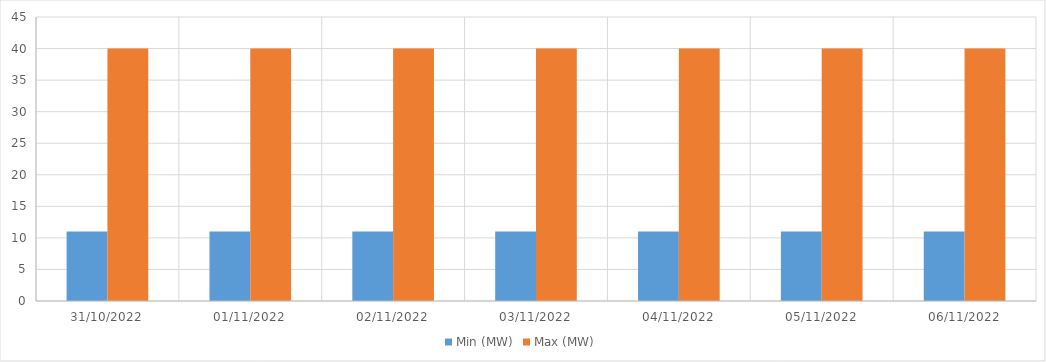
| Category | Min (MW) | Max (MW) |
|---|---|---|
| 31/10/2022 | 11 | 40 |
| 01/11/2022 | 11 | 40 |
| 02/11/2022 | 11 | 40 |
| 03/11/2022 | 11 | 40 |
| 04/11/2022 | 11 | 40 |
| 05/11/2022 | 11 | 40 |
| 06/11/2022 | 11 | 40 |